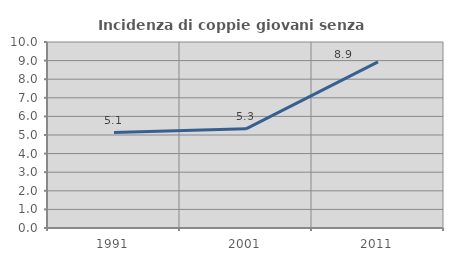
| Category | Incidenza di coppie giovani senza figli |
|---|---|
| 1991.0 | 5.128 |
| 2001.0 | 5.333 |
| 2011.0 | 8.929 |